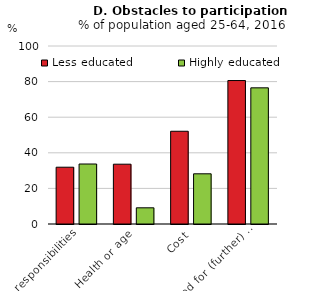
| Category | Less educated | Highly educated |
|---|---|---|
| Family responsibilities | 31.9 | 33.7 |
| Health or age | 33.6 | 9.1 |
| Cost | 52.1 | 28.2 |
| No need for (further) education or training | 80.6 | 76.5 |